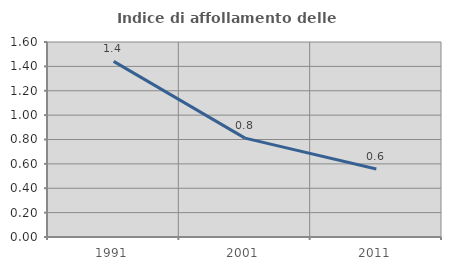
| Category | Indice di affollamento delle abitazioni  |
|---|---|
| 1991.0 | 1.441 |
| 2001.0 | 0.811 |
| 2011.0 | 0.558 |